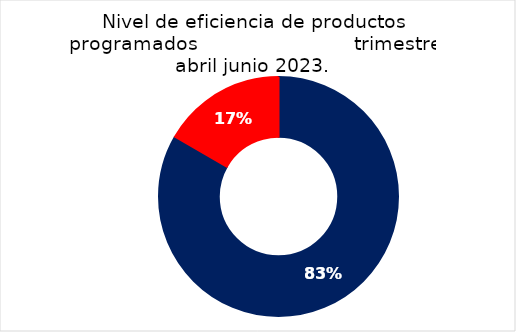
| Category | Series 0 |
|---|---|
| 90-100 | 15 |
| Otras | 3 |